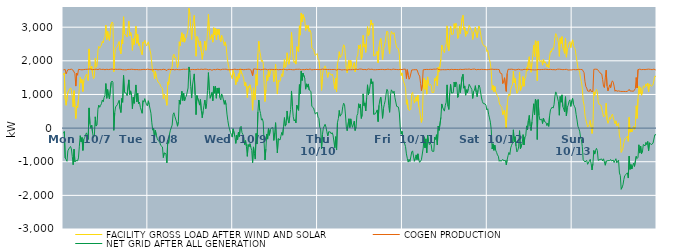
| Category | FACILITY GROSS LOAD AFTER WIND AND SOLAR | COGEN PRODUCTION | NET GRID AFTER ALL GENERATION |
|---|---|---|---|
|  Mon  10/7 | 1578 | 1731 | -153 |
|  Mon  10/7 | 1642 | 1745 | -103 |
|  Mon  10/7 | 853 | 1741 | -888 |
|  Mon  10/7 | 678 | 1610 | -932 |
|  Mon  10/7 | 690 | 1677 | -987 |
|  Mon  10/7 | 1063 | 1738 | -675 |
|  Mon  10/7 | 1062 | 1739 | -677 |
|  Mon  10/7 | 1162 | 1740 | -578 |
|  Mon  10/7 | 1196 | 1742 | -546 |
|  Mon  10/7 | 1131 | 1751 | -620 |
|  Mon  10/7 | 905 | 1752 | -847 |
|  Mon  10/7 | 629 | 1718 | -1089 |
|  Mon  10/7 | 1112 | 1739 | -627 |
|  Mon  10/7 | 612 | 1618 | -1006 |
|  Mon  10/7 | 283 | 1249 | -966 |
|  Mon  10/7 | 658 | 1634 | -976 |
|  Mon  10/7 | 598 | 1572 | -974 |
|  Mon  10/7 | 860 | 1746 | -886 |
|  Mon  10/7 | 1198 | 1736 | -538 |
|  Mon  10/7 | 1513 | 1739 | -226 |
|  Mon  10/7 | 1339 | 1748 | -409 |
|  Mon  10/7 | 1453 | 1732 | -279 |
|  Mon  10/7 | 1088 | 1752 | -664 |
|  Mon  10/7 | 1409 | 1740 | -331 |
|  Mon  10/7 | 1474 | 1755 | -281 |
|  Mon  10/7 | 1460 | 1746 | -286 |
|  Mon  10/7 | 1602 | 1744 | -142 |
|  Mon  10/7 | 1542 | 1748 | -206 |
|  Mon  10/7 | 1415 | 1753 | -338 |
|  Mon  10/7 | 2354 | 1754 | 600 |
|  Mon  10/7 | 1862 | 1735 | 127 |
|  Mon  10/7 | 1746 | 1753 | -7 |
|  Mon  10/7 | 1835 | 1752 | 83 |
|  Mon  10/7 | 1590 | 1738 | -148 |
|  Mon  10/7 | 1469 | 1749 | -280 |
|  Mon  10/7 | 1520 | 1743 | -223 |
|  Mon  10/7 | 2074 | 1739 | 335 |
|  Mon  10/7 | 1810 | 1751 | 59 |
|  Mon  10/7 | 1853 | 1755 | 98 |
|  Mon  10/7 | 2298 | 1739 | 559 |
|  Mon  10/7 | 2432 | 1746 | 686 |
|  Mon  10/7 | 2377 | 1758 | 619 |
|  Mon  10/7 | 2421 | 1750 | 671 |
|  Mon  10/7 | 2471 | 1743 | 728 |
|  Mon  10/7 | 2579 | 1743 | 836 |
|  Mon  10/7 | 2530 | 1748 | 782 |
|  Mon  10/7 | 2658 | 1746 | 912 |
|  Mon  10/7 | 2707 | 1735 | 972 |
|  Mon  10/7 | 3061 | 1737 | 1324 |
|  Mon  10/7 | 2634 | 1748 | 886 |
|  Mon  10/7 | 2885 | 1739 | 1146 |
|  Mon  10/7 | 2709 | 1740 | 969 |
|  Mon  10/7 | 2600 | 1735 | 865 |
|  Mon  10/7 | 2615 | 1748 | 867 |
|  Mon  10/7 | 3094 | 1736 | 1358 |
|  Mon  10/7 | 3155 | 1756 | 1399 |
|  Mon  10/7 | 3123 | 1769 | 1354 |
|  Mon  10/7 | 1674 | 1741 | -67 |
|  Mon  10/7 | 2186 | 1729 | 457 |
|  Mon  10/7 | 2378 | 1749 | 629 |
|  Mon  10/7 | 2369 | 1733 | 636 |
|  Mon  10/7 | 2441 | 1745 | 696 |
|  Mon  10/7 | 2431 | 1742 | 689 |
|  Mon  10/7 | 2572 | 1749 | 823 |
|  Mon  10/7 | 2312 | 1737 | 575 |
|  Mon  10/7 | 2209 | 1747 | 462 |
|  Mon  10/7 | 2624 | 1742 | 882 |
|  Mon  10/7 | 2503 | 1736 | 767 |
|  Mon  10/7 | 3308 | 1744 | 1564 |
|  Mon  10/7 | 2799 | 1734 | 1065 |
|  Mon  10/7 | 2791 | 1750 | 1041 |
|  Mon  10/7 | 2767 | 1732 | 1035 |
|  Mon  10/7 | 2709 | 1740 | 969 |
|  Mon  10/7 | 2725 | 1745 | 980 |
|  Mon  10/7 | 3178 | 1745 | 1433 |
|  Mon  10/7 | 2741 | 1743 | 998 |
|  Mon  10/7 | 2845 | 1738 | 1107 |
|  Mon  10/7 | 2727 | 1749 | 978 |
|  Mon  10/7 | 2312 | 1735 | 577 |
|  Mon  10/7 | 2661 | 1744 | 917 |
|  Mon  10/7 | 2480 | 1745 | 735 |
|  Mon  10/7 | 2747 | 1737 | 1010 |
|  Mon  10/7 | 3032 | 1749 | 1283 |
|  Mon  10/7 | 2521 | 1741 | 780 |
|  Mon  10/7 | 2790 | 1750 | 1040 |
|  Mon  10/7 | 2458 | 1735 | 723 |
|  Mon  10/7 | 2524 | 1752 | 772 |
|  Mon  10/7 | 2353 | 1735 | 618 |
|  Mon  10/7 | 2374 | 1734 | 640 |
|  Mon  10/7 | 2180 | 1739 | 441 |
|  Mon  10/7 | 2561 | 1746 | 815 |
|  Mon  10/7 | 2520 | 1746 | 774 |
|  Mon  10/7 | 2615 | 1738 | 877 |
|  Mon  10/7 | 2609 | 1738 | 871 |
|  Mon  10/7 | 2440 | 1748 | 692 |
|  Mon  10/7 | 2412 | 1752 | 660 |
|  Tue  10/8 | 2565 | 1753 | 812 |
|  Tue  10/8 | 2443 | 1744 | 699 |
|  Tue  10/8 | 2309 | 1740 | 569 |
|  Tue  10/8 | 2178 | 1736 | 442 |
|  Tue  10/8 | 1907 | 1750 | 157 |
|  Tue  10/8 | 1670 | 1733 | -63 |
|  Tue  10/8 | 1728 | 1731 | -3 |
|  Tue  10/8 | 1462 | 1744 | -282 |
|  Tue  10/8 | 1681 | 1749 | -68 |
|  Tue  10/8 | 1539 | 1745 | -206 |
|  Tue  10/8 | 1449 | 1751 | -302 |
|  Tue  10/8 | 1365 | 1732 | -367 |
|  Tue  10/8 | 1378 | 1732 | -354 |
|  Tue  10/8 | 1322 | 1740 | -418 |
|  Tue  10/8 | 1236 | 1748 | -512 |
|  Tue  10/8 | 1214 | 1735 | -521 |
|  Tue  10/8 | 1188 | 1748 | -560 |
|  Tue  10/8 | 873 | 1748 | -875 |
|  Tue  10/8 | 1010 | 1747 | -737 |
|  Tue  10/8 | 977 | 1739 | -762 |
|  Tue  10/8 | 969 | 1734 | -765 |
|  Tue  10/8 | 677 | 1711 | -1034 |
|  Tue  10/8 | 1373 | 1744 | -371 |
|  Tue  10/8 | 1291 | 1741 | -450 |
|  Tue  10/8 | 1569 | 1747 | -178 |
|  Tue  10/8 | 1677 | 1740 | -63 |
|  Tue  10/8 | 1655 | 1738 | -83 |
|  Tue  10/8 | 1819 | 1729 | 90 |
|  Tue  10/8 | 2149 | 1745 | 404 |
|  Tue  10/8 | 2196 | 1740 | 456 |
|  Tue  10/8 | 2083 | 1732 | 351 |
|  Tue  10/8 | 2114 | 1751 | 363 |
|  Tue  10/8 | 1927 | 1746 | 181 |
|  Tue  10/8 | 1800 | 1745 | 55 |
|  Tue  10/8 | 1921 | 1737 | 184 |
|  Tue  10/8 | 2567 | 1738 | 829 |
|  Tue  10/8 | 2444 | 1735 | 709 |
|  Tue  10/8 | 2463 | 1736 | 727 |
|  Tue  10/8 | 2835 | 1743 | 1092 |
|  Tue  10/8 | 2564 | 1743 | 821 |
|  Tue  10/8 | 2791 | 1750 | 1041 |
|  Tue  10/8 | 2554 | 1748 | 806 |
|  Tue  10/8 | 2659 | 1745 | 914 |
|  Tue  10/8 | 2692 | 1745 | 947 |
|  Tue  10/8 | 2671 | 1753 | 918 |
|  Tue  10/8 | 2934 | 1742 | 1192 |
|  Tue  10/8 | 3561 | 1743 | 1818 |
|  Tue  10/8 | 3403 | 1734 | 1669 |
|  Tue  10/8 | 2975 | 1736 | 1239 |
|  Tue  10/8 | 2633 | 1740 | 893 |
|  Tue  10/8 | 3022 | 1744 | 1278 |
|  Tue  10/8 | 3021 | 1740 | 1281 |
|  Tue  10/8 | 3351 | 1740 | 1611 |
|  Tue  10/8 | 2741 | 1753 | 988 |
|  Tue  10/8 | 2136 | 1737 | 399 |
|  Tue  10/8 | 2726 | 1758 | 968 |
|  Tue  10/8 | 2690 | 1751 | 939 |
|  Tue  10/8 | 2539 | 1750 | 789 |
|  Tue  10/8 | 2424 | 1741 | 683 |
|  Tue  10/8 | 2589 | 1739 | 850 |
|  Tue  10/8 | 2270 | 1751 | 519 |
|  Tue  10/8 | 2043 | 1736 | 307 |
|  Tue  10/8 | 2240 | 1741 | 499 |
|  Tue  10/8 | 2414 | 1742 | 672 |
|  Tue  10/8 | 2586 | 1753 | 833 |
|  Tue  10/8 | 2312 | 1734 | 578 |
|  Tue  10/8 | 2471 | 1748 | 723 |
|  Tue  10/8 | 2873 | 1755 | 1118 |
|  Tue  10/8 | 3381 | 1732 | 1649 |
|  Tue  10/8 | 2870 | 1746 | 1124 |
|  Tue  10/8 | 2631 | 1744 | 887 |
|  Tue  10/8 | 2631 | 1730 | 901 |
|  Tue  10/8 | 2778 | 1720 | 1058 |
|  Tue  10/8 | 2555 | 1740 | 815 |
|  Tue  10/8 | 2984 | 1743 | 1241 |
|  Tue  10/8 | 2770 | 1733 | 1037 |
|  Tue  10/8 | 2976 | 1735 | 1241 |
|  Tue  10/8 | 2630 | 1742 | 888 |
|  Tue  10/8 | 2943 | 1751 | 1192 |
|  Tue  10/8 | 2781 | 1745 | 1036 |
|  Tue  10/8 | 2937 | 1742 | 1195 |
|  Tue  10/8 | 2654 | 1750 | 904 |
|  Tue  10/8 | 2571 | 1733 | 838 |
|  Tue  10/8 | 2758 | 1742 | 1016 |
|  Tue  10/8 | 2700 | 1749 | 951 |
|  Tue  10/8 | 2685 | 1737 | 948 |
|  Tue  10/8 | 2456 | 1748 | 708 |
|  Tue  10/8 | 2563 | 1743 | 820 |
|  Tue  10/8 | 2445 | 1752 | 693 |
|  Tue  10/8 | 2165 | 1749 | 416 |
|  Tue  10/8 | 1953 | 1732 | 221 |
|  Tue  10/8 | 1804 | 1745 | 59 |
|  Tue  10/8 | 1807 | 1736 | 71 |
|  Tue  10/8 | 1609 | 1742 | -133 |
|  Tue  10/8 | 1550 | 1737 | -187 |
|  Tue  10/8 | 1470 | 1738 | -268 |
|  Wed  10/9 | 1723 | 1743 | -20 |
|  Wed  10/9 | 1751 | 1744 | 7 |
|  Wed  10/9 | 1496 | 1751 | -255 |
|  Wed  10/9 | 1287 | 1742 | -455 |
|  Wed  10/9 | 1525 | 1739 | -214 |
|  Wed  10/9 | 1387 | 1737 | -350 |
|  Wed  10/9 | 1618 | 1740 | -122 |
|  Wed  10/9 | 1486 | 1739 | -253 |
|  Wed  10/9 | 1763 | 1746 | 17 |
|  Wed  10/9 | 1791 | 1738 | 53 |
|  Wed  10/9 | 1607 | 1744 | -137 |
|  Wed  10/9 | 1552 | 1741 | -189 |
|  Wed  10/9 | 1461 | 1735 | -274 |
|  Wed  10/9 | 1254 | 1746 | -492 |
|  Wed  10/9 | 1370 | 1742 | -372 |
|  Wed  10/9 | 1204 | 1749 | -545 |
|  Wed  10/9 | 907 | 1747 | -840 |
|  Wed  10/9 | 1246 | 1738 | -492 |
|  Wed  10/9 | 1199 | 1753 | -554 |
|  Wed  10/9 | 1290 | 1752 | -462 |
|  Wed  10/9 | 1164 | 1734 | -570 |
|  Wed  10/9 | 1085 | 1748 | -663 |
|  Wed  10/9 | 530 | 1560 | -1030 |
|  Wed  10/9 | 1197 | 1756 | -559 |
|  Wed  10/9 | 978 | 1733 | -755 |
|  Wed  10/9 | 836 | 1757 | -921 |
|  Wed  10/9 | 1590 | 1750 | -160 |
|  Wed  10/9 | 1271 | 1745 | -474 |
|  Wed  10/9 | 2214 | 1734 | 480 |
|  Wed  10/9 | 2582 | 1747 | 835 |
|  Wed  10/9 | 2291 | 1755 | 536 |
|  Wed  10/9 | 2168 | 1734 | 434 |
|  Wed  10/9 | 1978 | 1741 | 237 |
|  Wed  10/9 | 2020 | 1741 | 279 |
|  Wed  10/9 | 1927 | 1746 | 181 |
|  Wed  10/9 | 1330 | 1752 | -422 |
|  Wed  10/9 | 789 | 1737 | -948 |
|  Wed  10/9 | 1133 | 1751 | -618 |
|  Wed  10/9 | 1566 | 1741 | -175 |
|  Wed  10/9 | 1405 | 1733 | -328 |
|  Wed  10/9 | 1731 | 1734 | -3 |
|  Wed  10/9 | 1532 | 1746 | -214 |
|  Wed  10/9 | 1689 | 1739 | -50 |
|  Wed  10/9 | 1745 | 1746 | -1 |
|  Wed  10/9 | 1713 | 1726 | -13 |
|  Wed  10/9 | 1758 | 1744 | 14 |
|  Wed  10/9 | 1380 | 1746 | -366 |
|  Wed  10/9 | 1588 | 1738 | -150 |
|  Wed  10/9 | 1900 | 1739 | 161 |
|  Wed  10/9 | 1370 | 1747 | -377 |
|  Wed  10/9 | 1012 | 1751 | -739 |
|  Wed  10/9 | 1420 | 1734 | -314 |
|  Wed  10/9 | 1423 | 1759 | -336 |
|  Wed  10/9 | 1385 | 1741 | -356 |
|  Wed  10/9 | 1506 | 1747 | -241 |
|  Wed  10/9 | 1613 | 1740 | -127 |
|  Wed  10/9 | 1530 | 1742 | -212 |
|  Wed  10/9 | 1799 | 1749 | 50 |
|  Wed  10/9 | 2047 | 1735 | 312 |
|  Wed  10/9 | 1800 | 1742 | 58 |
|  Wed  10/9 | 1872 | 1747 | 125 |
|  Wed  10/9 | 2239 | 1730 | 509 |
|  Wed  10/9 | 2003 | 1749 | 254 |
|  Wed  10/9 | 1896 | 1747 | 149 |
|  Wed  10/9 | 2079 | 1730 | 349 |
|  Wed  10/9 | 2292 | 1743 | 549 |
|  Wed  10/9 | 2844 | 1740 | 1104 |
|  Wed  10/9 | 2374 | 1736 | 638 |
|  Wed  10/9 | 2077 | 1740 | 337 |
|  Wed  10/9 | 1944 | 1733 | 211 |
|  Wed  10/9 | 1998 | 1745 | 253 |
|  Wed  10/9 | 1902 | 1748 | 154 |
|  Wed  10/9 | 2422 | 1741 | 681 |
|  Wed  10/9 | 2414 | 1747 | 667 |
|  Wed  10/9 | 2275 | 1746 | 529 |
|  Wed  10/9 | 3042 | 1750 | 1292 |
|  Wed  10/9 | 2764 | 1739 | 1025 |
|  Wed  10/9 | 3423 | 1730 | 1693 |
|  Wed  10/9 | 3158 | 1743 | 1415 |
|  Wed  10/9 | 3376 | 1740 | 1636 |
|  Wed  10/9 | 3391 | 1743 | 1648 |
|  Wed  10/9 | 3215 | 1736 | 1479 |
|  Wed  10/9 | 2901 | 1744 | 1157 |
|  Wed  10/9 | 3064 | 1749 | 1315 |
|  Wed  10/9 | 2965 | 1747 | 1218 |
|  Wed  10/9 | 3051 | 1738 | 1313 |
|  Wed  10/9 | 2870 | 1737 | 1133 |
|  Wed  10/9 | 2909 | 1757 | 1152 |
|  Wed  10/9 | 2831 | 1741 | 1090 |
|  Wed  10/9 | 2376 | 1731 | 645 |
|  Wed  10/9 | 2376 | 1748 | 628 |
|  Wed  10/9 | 2338 | 1740 | 598 |
|  Wed  10/9 | 2241 | 1744 | 497 |
|  Wed  10/9 | 2156 | 1741 | 415 |
|  Wed  10/9 | 2165 | 1735 | 430 |
|  Wed  10/9 | 2218 | 1745 | 473 |
|  Thu  10/10 | 2063 | 1738 | 325 |
|  Thu  10/10 | 2026 | 1738 | 288 |
|  Thu  10/10 | 1760 | 1742 | 18 |
|  Thu  10/10 | 1714 | 1741 | -27 |
|  Thu  10/10 | 1122 | 1739 | -617 |
|  Thu  10/10 | 1560 | 1753 | -193 |
|  Thu  10/10 | 1733 | 1736 | -3 |
|  Thu  10/10 | 1724 | 1744 | -20 |
|  Thu  10/10 | 1851 | 1738 | 113 |
|  Thu  10/10 | 1775 | 1744 | 31 |
|  Thu  10/10 | 1622 | 1731 | -109 |
|  Thu  10/10 | 1507 | 1742 | -235 |
|  Thu  10/10 | 1648 | 1759 | -111 |
|  Thu  10/10 | 1640 | 1744 | -104 |
|  Thu  10/10 | 1617 | 1733 | -116 |
|  Thu  10/10 | 1569 | 1742 | -173 |
|  Thu  10/10 | 1607 | 1745 | -138 |
|  Thu  10/10 | 1531 | 1742 | -211 |
|  Thu  10/10 | 1510 | 1748 | -238 |
|  Thu  10/10 | 1156 | 1742 | -586 |
|  Thu  10/10 | 1485 | 1741 | -256 |
|  Thu  10/10 | 1074 | 1726 | -652 |
|  Thu  10/10 | 1915 | 1751 | 164 |
|  Thu  10/10 | 2030 | 1748 | 282 |
|  Thu  10/10 | 2271 | 1747 | 524 |
|  Thu  10/10 | 2097 | 1743 | 354 |
|  Thu  10/10 | 2122 | 1743 | 379 |
|  Thu  10/10 | 2164 | 1728 | 436 |
|  Thu  10/10 | 2371 | 1733 | 638 |
|  Thu  10/10 | 2477 | 1737 | 740 |
|  Thu  10/10 | 2440 | 1742 | 698 |
|  Thu  10/10 | 2155 | 1735 | 420 |
|  Thu  10/10 | 1769 | 1736 | 33 |
|  Thu  10/10 | 1645 | 1723 | -78 |
|  Thu  10/10 | 1673 | 1750 | -77 |
|  Thu  10/10 | 2014 | 1737 | 277 |
|  Thu  10/10 | 1763 | 1747 | 16 |
|  Thu  10/10 | 2010 | 1736 | 274 |
|  Thu  10/10 | 1861 | 1742 | 119 |
|  Thu  10/10 | 1760 | 1738 | 22 |
|  Thu  10/10 | 1785 | 1750 | 35 |
|  Thu  10/10 | 1944 | 1738 | 206 |
|  Thu  10/10 | 1676 | 1747 | -71 |
|  Thu  10/10 | 1778 | 1753 | 25 |
|  Thu  10/10 | 2106 | 1736 | 370 |
|  Thu  10/10 | 2173 | 1740 | 433 |
|  Thu  10/10 | 2470 | 1746 | 724 |
|  Thu  10/10 | 2350 | 1754 | 596 |
|  Thu  10/10 | 2477 | 1761 | 716 |
|  Thu  10/10 | 2042 | 1754 | 288 |
|  Thu  10/10 | 2151 | 1743 | 408 |
|  Thu  10/10 | 2758 | 1740 | 1018 |
|  Thu  10/10 | 2410 | 1742 | 668 |
|  Thu  10/10 | 2492 | 1743 | 749 |
|  Thu  10/10 | 2252 | 1743 | 509 |
|  Thu  10/10 | 2630 | 1734 | 896 |
|  Thu  10/10 | 3021 | 1734 | 1287 |
|  Thu  10/10 | 2749 | 1758 | 991 |
|  Thu  10/10 | 2822 | 1739 | 1083 |
|  Thu  10/10 | 2836 | 1744 | 1092 |
|  Thu  10/10 | 3214 | 1748 | 1466 |
|  Thu  10/10 | 3064 | 1751 | 1313 |
|  Thu  10/10 | 3117 | 1738 | 1379 |
|  Thu  10/10 | 2144 | 1735 | 409 |
|  Thu  10/10 | 2148 | 1748 | 400 |
|  Thu  10/10 | 2161 | 1735 | 426 |
|  Thu  10/10 | 2188 | 1736 | 452 |
|  Thu  10/10 | 2281 | 1740 | 541 |
|  Thu  10/10 | 1938 | 1745 | 193 |
|  Thu  10/10 | 2419 | 1741 | 678 |
|  Thu  10/10 | 2590 | 1750 | 840 |
|  Thu  10/10 | 2665 | 1744 | 921 |
|  Thu  10/10 | 2374 | 1732 | 642 |
|  Thu  10/10 | 2034 | 1744 | 290 |
|  Thu  10/10 | 2336 | 1754 | 582 |
|  Thu  10/10 | 2442 | 1738 | 704 |
|  Thu  10/10 | 2560 | 1745 | 815 |
|  Thu  10/10 | 2752 | 1740 | 1012 |
|  Thu  10/10 | 2886 | 1733 | 1153 |
|  Thu  10/10 | 2853 | 1752 | 1101 |
|  Thu  10/10 | 2401 | 1731 | 670 |
|  Thu  10/10 | 2212 | 1743 | 469 |
|  Thu  10/10 | 2718 | 1742 | 976 |
|  Thu  10/10 | 2874 | 1736 | 1138 |
|  Thu  10/10 | 2876 | 1745 | 1131 |
|  Thu  10/10 | 2789 | 1754 | 1035 |
|  Thu  10/10 | 2838 | 1740 | 1098 |
|  Thu  10/10 | 2651 | 1744 | 907 |
|  Thu  10/10 | 2667 | 1746 | 921 |
|  Thu  10/10 | 2388 | 1742 | 646 |
|  Thu  10/10 | 2395 | 1737 | 658 |
|  Thu  10/10 | 2361 | 1737 | 624 |
|  Thu  10/10 | 2188 | 1739 | 449 |
|  Thu  10/10 | 1762 | 1747 | 15 |
|  Thu  10/10 | 1563 | 1745 | -182 |
|  Thu  10/10 | 1641 | 1737 | -96 |
|  Fri  10/11 | 1461 | 1734 | -273 |
|  Fri  10/11 | 1373 | 1751 | -378 |
|  Fri  10/11 | 1375 | 1739 | -364 |
|  Fri  10/11 | 1203 | 1750 | -547 |
|  Fri  10/11 | 707 | 1474 | -767 |
|  Fri  10/11 | 841 | 1739 | -898 |
|  Fri  10/11 | 573 | 1584 | -1011 |
|  Fri  10/11 | 526 | 1451 | -925 |
|  Fri  10/11 | 511 | 1508 | -997 |
|  Fri  10/11 | 557 | 1531 | -974 |
|  Fri  10/11 | 1017 | 1728 | -711 |
|  Fri  10/11 | 1062 | 1739 | -677 |
|  Fri  10/11 | 905 | 1734 | -829 |
|  Fri  10/11 | 743 | 1729 | -986 |
|  Fri  10/11 | 833 | 1736 | -903 |
|  Fri  10/11 | 933 | 1729 | -796 |
|  Fri  10/11 | 799 | 1736 | -937 |
|  Fri  10/11 | 984 | 1749 | -765 |
|  Fri  10/11 | 636 | 1583 | -947 |
|  Fri  10/11 | 528 | 1546 | -1018 |
|  Fri  10/11 | 326 | 1332 | -1006 |
|  Fri  10/11 | 169 | 1111 | -942 |
|  Fri  10/11 | 310 | 1280 | -970 |
|  Fri  10/11 | 1141 | 1734 | -593 |
|  Fri  10/11 | 1490 | 1745 | -255 |
|  Fri  10/11 | 1151 | 1740 | -589 |
|  Fri  10/11 | 1426 | 1746 | -320 |
|  Fri  10/11 | 1010 | 1745 | -735 |
|  Fri  10/11 | 1522 | 1734 | -212 |
|  Fri  10/11 | 1340 | 1741 | -401 |
|  Fri  10/11 | 1260 | 1750 | -490 |
|  Fri  10/11 | 1305 | 1748 | -443 |
|  Fri  10/11 | 1272 | 1762 | -490 |
|  Fri  10/11 | 1057 | 1742 | -685 |
|  Fri  10/11 | 1071 | 1741 | -670 |
|  Fri  10/11 | 1060 | 1753 | -693 |
|  Fri  10/11 | 1478 | 1744 | -266 |
|  Fri  10/11 | 1413 | 1750 | -337 |
|  Fri  10/11 | 1545 | 1742 | -197 |
|  Fri  10/11 | 1258 | 1761 | -503 |
|  Fri  10/11 | 1811 | 1750 | 61 |
|  Fri  10/11 | 1670 | 1738 | -68 |
|  Fri  10/11 | 1650 | 1730 | -80 |
|  Fri  10/11 | 2050 | 1732 | 318 |
|  Fri  10/11 | 2470 | 1752 | 718 |
|  Fri  10/11 | 2351 | 1738 | 613 |
|  Fri  10/11 | 2347 | 1744 | 603 |
|  Fri  10/11 | 2240 | 1736 | 504 |
|  Fri  10/11 | 2420 | 1742 | 678 |
|  Fri  10/11 | 2504 | 1735 | 769 |
|  Fri  10/11 | 3039 | 1754 | 1285 |
|  Fri  10/11 | 2399 | 1746 | 653 |
|  Fri  10/11 | 2294 | 1740 | 554 |
|  Fri  10/11 | 2777 | 1736 | 1041 |
|  Fri  10/11 | 3033 | 1734 | 1299 |
|  Fri  10/11 | 2788 | 1747 | 1041 |
|  Fri  10/11 | 2767 | 1749 | 1018 |
|  Fri  10/11 | 2792 | 1740 | 1052 |
|  Fri  10/11 | 3104 | 1736 | 1368 |
|  Fri  10/11 | 2964 | 1743 | 1221 |
|  Fri  10/11 | 3117 | 1745 | 1372 |
|  Fri  10/11 | 3053 | 1741 | 1312 |
|  Fri  10/11 | 2661 | 1751 | 910 |
|  Fri  10/11 | 2705 | 1739 | 966 |
|  Fri  10/11 | 3035 | 1743 | 1292 |
|  Fri  10/11 | 2804 | 1748 | 1056 |
|  Fri  10/11 | 2780 | 1752 | 1028 |
|  Fri  10/11 | 3261 | 1739 | 1522 |
|  Fri  10/11 | 3356 | 1754 | 1602 |
|  Fri  10/11 | 2931 | 1745 | 1186 |
|  Fri  10/11 | 3002 | 1749 | 1253 |
|  Fri  10/11 | 2729 | 1751 | 978 |
|  Fri  10/11 | 2884 | 1745 | 1139 |
|  Fri  10/11 | 2800 | 1748 | 1052 |
|  Fri  10/11 | 2915 | 1740 | 1175 |
|  Fri  10/11 | 3057 | 1756 | 1301 |
|  Fri  10/11 | 3044 | 1744 | 1300 |
|  Fri  10/11 | 2937 | 1739 | 1198 |
|  Fri  10/11 | 2904 | 1753 | 1151 |
|  Fri  10/11 | 2633 | 1751 | 882 |
|  Fri  10/11 | 2841 | 1749 | 1092 |
|  Fri  10/11 | 2884 | 1755 | 1129 |
|  Fri  10/11 | 2998 | 1737 | 1261 |
|  Fri  10/11 | 2799 | 1734 | 1065 |
|  Fri  10/11 | 2690 | 1756 | 934 |
|  Fri  10/11 | 2874 | 1746 | 1128 |
|  Fri  10/11 | 3030 | 1749 | 1281 |
|  Fri  10/11 | 2958 | 1740 | 1218 |
|  Fri  10/11 | 2964 | 1753 | 1211 |
|  Fri  10/11 | 2642 | 1747 | 895 |
|  Fri  10/11 | 2514 | 1728 | 786 |
|  Fri  10/11 | 2471 | 1742 | 729 |
|  Fri  10/11 | 2440 | 1729 | 711 |
|  Fri  10/11 | 2460 | 1741 | 719 |
|  Fri  10/11 | 2427 | 1747 | 680 |
|  Fri  10/11 | 2274 | 1735 | 539 |
|  Sat  10/12 | 2317 | 1742 | 575 |
|  Sat  10/12 | 2153 | 1742 | 411 |
|  Sat  10/12 | 2039 | 1737 | 302 |
|  Sat  10/12 | 1924 | 1748 | 176 |
|  Sat  10/12 | 1686 | 1733 | -47 |
|  Sat  10/12 | 1130 | 1752 | -622 |
|  Sat  10/12 | 1270 | 1737 | -467 |
|  Sat  10/12 | 1082 | 1744 | -662 |
|  Sat  10/12 | 1237 | 1745 | -508 |
|  Sat  10/12 | 1085 | 1746 | -661 |
|  Sat  10/12 | 1017 | 1738 | -721 |
|  Sat  10/12 | 946 | 1745 | -799 |
|  Sat  10/12 | 915 | 1750 | -835 |
|  Sat  10/12 | 752 | 1739 | -987 |
|  Sat  10/12 | 684 | 1638 | -954 |
|  Sat  10/12 | 676 | 1665 | -989 |
|  Sat  10/12 | 613 | 1615 | -1002 |
|  Sat  10/12 | 396 | 1325 | -929 |
|  Sat  10/12 | 419 | 1391 | -972 |
|  Sat  10/12 | 535 | 1498 | -963 |
|  Sat  10/12 | 554 | 1515 | -961 |
|  Sat  10/12 | -1 | 1092 | -1093 |
|  Sat  10/12 | 690 | 1628 | -938 |
|  Sat  10/12 | 928 | 1748 | -820 |
|  Sat  10/12 | 1016 | 1740 | -724 |
|  Sat  10/12 | 960 | 1747 | -787 |
|  Sat  10/12 | 1154 | 1743 | -589 |
|  Sat  10/12 | 1240 | 1751 | -511 |
|  Sat  10/12 | 1293 | 1738 | -445 |
|  Sat  10/12 | 1692 | 1742 | -50 |
|  Sat  10/12 | 1342 | 1745 | -403 |
|  Sat  10/12 | 1475 | 1729 | -254 |
|  Sat  10/12 | 1199 | 1731 | -532 |
|  Sat  10/12 | 1031 | 1738 | -707 |
|  Sat  10/12 | 1076 | 1738 | -662 |
|  Sat  10/12 | 1189 | 1751 | -562 |
|  Sat  10/12 | 1667 | 1744 | -77 |
|  Sat  10/12 | 1118 | 1734 | -616 |
|  Sat  10/12 | 1137 | 1740 | -603 |
|  Sat  10/12 | 1274 | 1730 | -456 |
|  Sat  10/12 | 1533 | 1728 | -195 |
|  Sat  10/12 | 1243 | 1746 | -503 |
|  Sat  10/12 | 1474 | 1741 | -267 |
|  Sat  10/12 | 1514 | 1744 | -230 |
|  Sat  10/12 | 1803 | 1738 | 65 |
|  Sat  10/12 | 1696 | 1749 | -53 |
|  Sat  10/12 | 1968 | 1738 | 230 |
|  Sat  10/12 | 2121 | 1743 | 378 |
|  Sat  10/12 | 1798 | 1741 | 57 |
|  Sat  10/12 | 1661 | 1734 | -73 |
|  Sat  10/12 | 1932 | 1752 | 180 |
|  Sat  10/12 | 2180 | 1733 | 447 |
|  Sat  10/12 | 2466 | 1743 | 723 |
|  Sat  10/12 | 2125 | 1731 | 394 |
|  Sat  10/12 | 2597 | 1736 | 861 |
|  Sat  10/12 | 2541 | 1732 | 809 |
|  Sat  10/12 | 1408 | 1748 | -340 |
|  Sat  10/12 | 2590 | 1743 | 847 |
|  Sat  10/12 | 2118 | 1739 | 379 |
|  Sat  10/12 | 1980 | 1737 | 243 |
|  Sat  10/12 | 2005 | 1743 | 262 |
|  Sat  10/12 | 2006 | 1742 | 264 |
|  Sat  10/12 | 1871 | 1735 | 136 |
|  Sat  10/12 | 2043 | 1743 | 300 |
|  Sat  10/12 | 1941 | 1739 | 202 |
|  Sat  10/12 | 1971 | 1750 | 221 |
|  Sat  10/12 | 1914 | 1750 | 164 |
|  Sat  10/12 | 1816 | 1745 | 71 |
|  Sat  10/12 | 1888 | 1737 | 151 |
|  Sat  10/12 | 1790 | 1740 | 50 |
|  Sat  10/12 | 2124 | 1753 | 371 |
|  Sat  10/12 | 2293 | 1747 | 546 |
|  Sat  10/12 | 2258 | 1741 | 517 |
|  Sat  10/12 | 2364 | 1738 | 626 |
|  Sat  10/12 | 2334 | 1740 | 594 |
|  Sat  10/12 | 2433 | 1738 | 695 |
|  Sat  10/12 | 2691 | 1741 | 950 |
|  Sat  10/12 | 2809 | 1732 | 1077 |
|  Sat  10/12 | 2743 | 1741 | 1002 |
|  Sat  10/12 | 2736 | 1751 | 985 |
|  Sat  10/12 | 2536 | 1754 | 782 |
|  Sat  10/12 | 2133 | 1751 | 382 |
|  Sat  10/12 | 2681 | 1743 | 938 |
|  Sat  10/12 | 2512 | 1744 | 768 |
|  Sat  10/12 | 2719 | 1731 | 988 |
|  Sat  10/12 | 2374 | 1738 | 636 |
|  Sat  10/12 | 2310 | 1744 | 566 |
|  Sat  10/12 | 2221 | 1741 | 480 |
|  Sat  10/12 | 2664 | 1731 | 933 |
|  Sat  10/12 | 2108 | 1747 | 361 |
|  Sat  10/12 | 2360 | 1743 | 617 |
|  Sat  10/12 | 2403 | 1727 | 676 |
|  Sat  10/12 | 2529 | 1735 | 794 |
|  Sat  10/12 | 2571 | 1730 | 841 |
|  Sat  10/12 | 2391 | 1748 | 643 |
|  Sat  10/12 | 2542 | 1730 | 812 |
|  Sun  10/13 | 2624 | 1741 | 883 |
|  Sun  10/13 | 2452 | 1742 | 710 |
|  Sun  10/13 | 2393 | 1743 | 650 |
|  Sun  10/13 | 2332 | 1735 | 597 |
|  Sun  10/13 | 2146 | 1740 | 406 |
|  Sun  10/13 | 1980 | 1737 | 243 |
|  Sun  10/13 | 1788 | 1731 | 57 |
|  Sun  10/13 | 1734 | 1747 | -13 |
|  Sun  10/13 | 1660 | 1752 | -92 |
|  Sun  10/13 | 1472 | 1743 | -271 |
|  Sun  10/13 | 1386 | 1730 | -344 |
|  Sun  10/13 | 1191 | 1739 | -548 |
|  Sun  10/13 | 807 | 1750 | -943 |
|  Sun  10/13 | 676 | 1646 | -970 |
|  Sun  10/13 | 379 | 1385 | -1006 |
|  Sun  10/13 | 248 | 1237 | -989 |
|  Sun  10/13 | 227 | 1190 | -963 |
|  Sun  10/13 | 28 | 1105 | -1077 |
|  Sun  10/13 | 25 | 1088 | -1063 |
|  Sun  10/13 | 114 | 1091 | -977 |
|  Sun  10/13 | 229 | 1158 | -929 |
|  Sun  10/13 | 32 | 1091 | -1059 |
|  Sun  10/13 | -160 | 1085 | -1245 |
|  Sun  10/13 | 35 | 1090 | -1055 |
|  Sun  10/13 | 1081 | 1747 | -666 |
|  Sun  10/13 | 972 | 1745 | -773 |
|  Sun  10/13 | 1082 | 1751 | -669 |
|  Sun  10/13 | 1152 | 1754 | -602 |
|  Sun  10/13 | 1081 | 1747 | -666 |
|  Sun  10/13 | 772 | 1732 | -960 |
|  Sun  10/13 | 704 | 1678 | -974 |
|  Sun  10/13 | 709 | 1642 | -933 |
|  Sun  10/13 | 683 | 1640 | -957 |
|  Sun  10/13 | 689 | 1607 | -918 |
|  Sun  10/13 | 463 | 1442 | -979 |
|  Sun  10/13 | 331 | 1244 | -913 |
|  Sun  10/13 | 313 | 1202 | -889 |
|  Sun  10/13 | 388 | 1492 | -1104 |
|  Sun  10/13 | 739 | 1721 | -982 |
|  Sun  10/13 | 253 | 1253 | -1000 |
|  Sun  10/13 | 139 | 1107 | -968 |
|  Sun  10/13 | 215 | 1200 | -985 |
|  Sun  10/13 | 316 | 1286 | -970 |
|  Sun  10/13 | 266 | 1199 | -933 |
|  Sun  10/13 | 362 | 1340 | -978 |
|  Sun  10/13 | 415 | 1406 | -991 |
|  Sun  10/13 | 412 | 1365 | -953 |
|  Sun  10/13 | 224 | 1248 | -1024 |
|  Sun  10/13 | 127 | 1094 | -967 |
|  Sun  10/13 | 220 | 1131 | -911 |
|  Sun  10/13 | 61 | 1095 | -1034 |
|  Sun  10/13 | 39 | 1087 | -1048 |
|  Sun  10/13 | 154 | 1106 | -952 |
|  Sun  10/13 | -240 | 1095 | -1335 |
|  Sun  10/13 | -320 | 1092 | -1412 |
|  Sun  10/13 | -724 | 1095 | -1819 |
|  Sun  10/13 | -672 | 1089 | -1761 |
|  Sun  10/13 | -598 | 1089 | -1687 |
|  Sun  10/13 | -437 | 1090 | -1527 |
|  Sun  10/13 | -327 | 1086 | -1413 |
|  Sun  10/13 | -354 | 1086 | -1440 |
|  Sun  10/13 | -273 | 1090 | -1363 |
|  Sun  10/13 | -239 | 1090 | -1329 |
|  Sun  10/13 | -395 | 1090 | -1485 |
|  Sun  10/13 | 318 | 1151 | -833 |
|  Sun  10/13 | -124 | 1104 | -1228 |
|  Sun  10/13 | -4 | 1080 | -1084 |
|  Sun  10/13 | -117 | 1100 | -1217 |
|  Sun  10/13 | -27 | 1090 | -1117 |
|  Sun  10/13 | 55 | 1096 | -1041 |
|  Sun  10/13 | -50 | 1091 | -1141 |
|  Sun  10/13 | 58 | 1175 | -1117 |
|  Sun  10/13 | 664 | 1503 | -839 |
|  Sun  10/13 | 289 | 1192 | -903 |
|  Sun  10/13 | 869 | 1738 | -869 |
|  Sun  10/13 | 1244 | 1741 | -497 |
|  Sun  10/13 | 1009 | 1752 | -743 |
|  Sun  10/13 | 1201 | 1739 | -538 |
|  Sun  10/13 | 976 | 1738 | -762 |
|  Sun  10/13 | 1030 | 1743 | -713 |
|  Sun  10/13 | 1254 | 1743 | -489 |
|  Sun  10/13 | 1269 | 1741 | -472 |
|  Sun  10/13 | 1208 | 1738 | -530 |
|  Sun  10/13 | 1315 | 1738 | -423 |
|  Sun  10/13 | 1251 | 1747 | -496 |
|  Sun  10/13 | 1340 | 1737 | -397 |
|  Sun  10/13 | 1083 | 1753 | -670 |
|  Sun  10/13 | 1312 | 1748 | -436 |
|  Sun  10/13 | 1314 | 1746 | -432 |
|  Sun  10/13 | 1242 | 1735 | -493 |
|  Sun  10/13 | 1271 | 1736 | -465 |
|  Sun  10/13 | 1291 | 1740 | -449 |
|  Sun  10/13 | 1298 | 1753 | -455 |
|  Sun  10/13 | 1537 | 1739 | -202 |
|  Sun  10/13 | 1510 | 1728 | -218 |
|  Sun  10/13 | 1543 | 1733 | -190 |